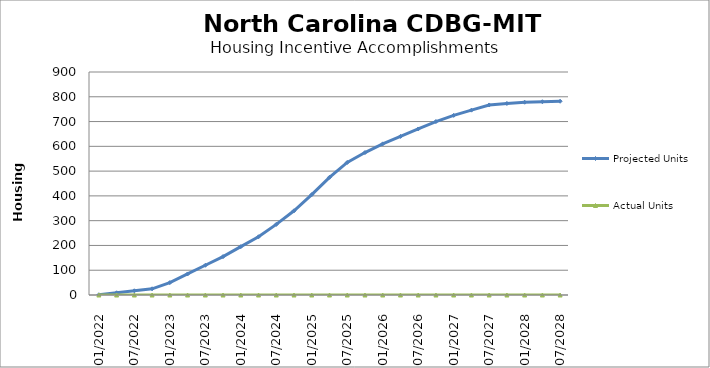
| Category | Projected Units | Actual Units |
|---|---|---|
| 01/2022 | 1 | 0 |
| 04/2022 | 9 | 0 |
| 07/2022 | 17 | 0 |
| 10/2022 | 25 | 0 |
| 01/2023 | 50 | 0 |
| 04/2023 | 85 | 0 |
| 07/2023 | 120 | 0 |
| 10/2023 | 155 | 0 |
| 01/2024 | 195 | 0 |
| 04/2024 | 235 | 0 |
| 07/2024 | 285 | 0 |
| 10/2024 | 340 | 0 |
| 01/2025 | 405 | 0 |
| 04/2025 | 475 | 0 |
| 07/2025 | 535 | 0 |
| 10/2025 | 575 | 0 |
| 01/2026 | 610 | 0 |
| 04/2026 | 640 | 0 |
| 07/2026 | 670 | 0 |
| 10/2026 | 700 | 0 |
| 01/2027 | 725 | 0 |
| 04/2027 | 746 | 0 |
| 07/2027 | 767 | 0 |
| 10/2027 | 773 | 0 |
| 01/2028 | 778 | 0 |
| 04/2028 | 780 | 0 |
| 07/2028 | 782 | 0 |